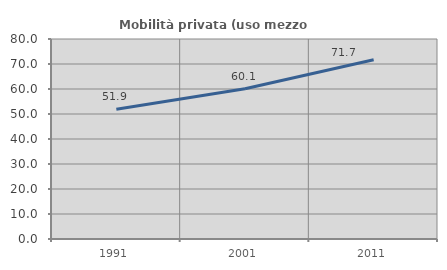
| Category | Mobilità privata (uso mezzo privato) |
|---|---|
| 1991.0 | 51.908 |
| 2001.0 | 60.131 |
| 2011.0 | 71.681 |